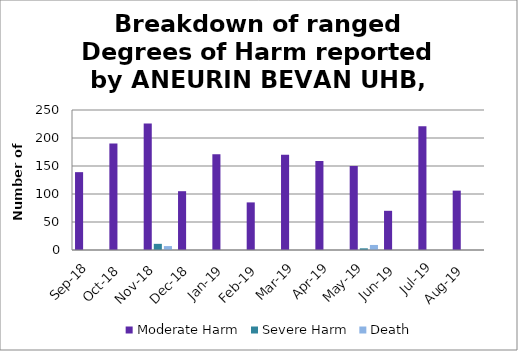
| Category | Moderate Harm | Severe Harm | Death |
|---|---|---|---|
| Sep-18 | 139 | 0 | 0 |
| Oct-18 | 190 | 0 | 0 |
| Nov-18 | 226 | 11 | 7 |
| Dec-18 | 105 | 0 | 0 |
| Jan-19 | 171 | 0 | 0 |
| Feb-19 | 85 | 0 | 0 |
| Mar-19 | 170 | 0 | 0 |
| Apr-19 | 159 | 0 | 0 |
| May-19 | 150 | 3 | 9 |
| Jun-19 | 70 | 0 | 0 |
| Jul-19 | 221 | 0 | 0 |
| Aug-19 | 106 | 0 | 0 |